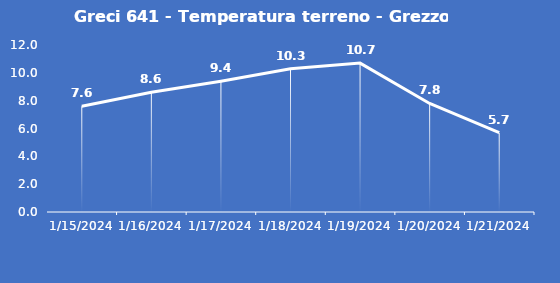
| Category | Greci 641 - Temperatura terreno - Grezzo (°C) |
|---|---|
| 1/15/24 | 7.6 |
| 1/16/24 | 8.6 |
| 1/17/24 | 9.4 |
| 1/18/24 | 10.3 |
| 1/19/24 | 10.7 |
| 1/20/24 | 7.8 |
| 1/21/24 | 5.7 |